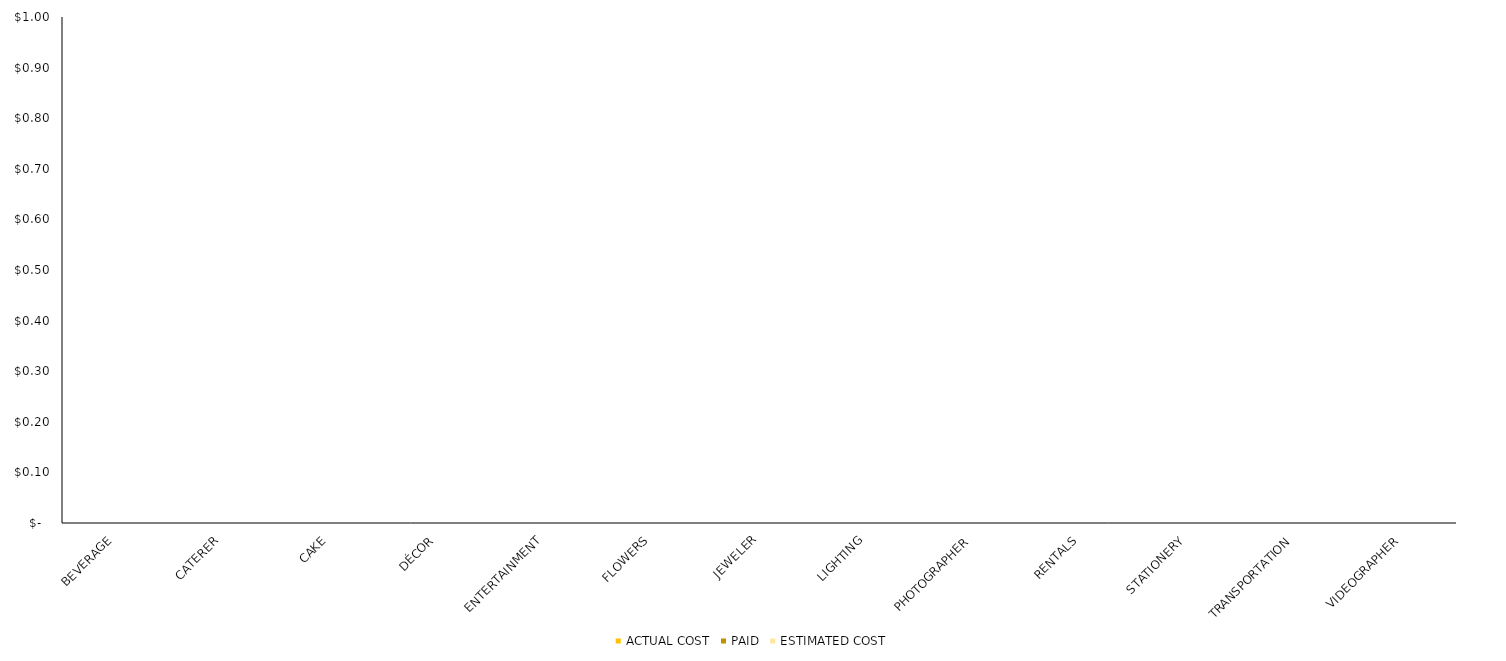
| Category |  ACTUAL COST  |  PAID  |  ESTIMATED COST  |
|---|---|---|---|
| BEVERAGE | 0 | 0 | 0 |
| CATERER | 0 | 0 | 0 |
| CAKE | 0 | 0 | 0 |
| DÉCOR | 0 | 0 | 0 |
| ENTERTAINMENT | 0 | 0 | 0 |
| FLOWERS | 0 | 0 | 0 |
| JEWELER | 0 | 0 | 0 |
| LIGHTING | 0 | 0 | 0 |
| PHOTOGRAPHER | 0 | 0 | 0 |
| RENTALS | 0 | 0 | 0 |
| STATIONERY | 0 | 0 | 0 |
| TRANSPORTATION | 0 | 0 | 0 |
| VIDEOGRAPHER | 0 | 0 | 0 |